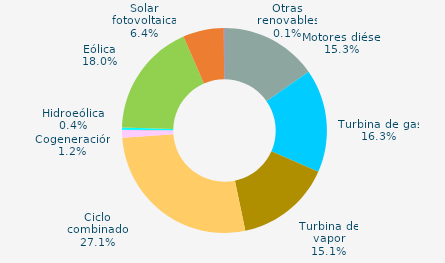
| Category | Series 0 |
|---|---|
| Motores diésel | 15.286 |
| Turbina de gas | 16.324 |
| Turbina de vapor | 15.129 |
| Ciclo combinado | 27.128 |
| Cogeneración | 1.197 |
| Hidráulica | 0.048 |
| Hidroeólica | 0.355 |
| Eólica | 17.972 |
| Solar fotovoltaica | 6.445 |
| Otras renovables | 0.116 |